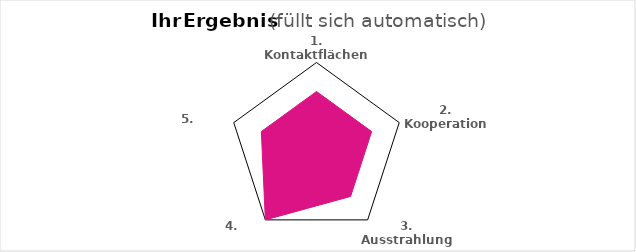
| Category | Series 0 |
|---|---|
| 1. Kontaktflächen bietend | 12 |
| 2. Kooperation fördernd | 12 |
| 3. Ausstrahlung fördernd | 12 |
| 4. Nachhaltig | 18 |
| 5. Motivierend | 12 |